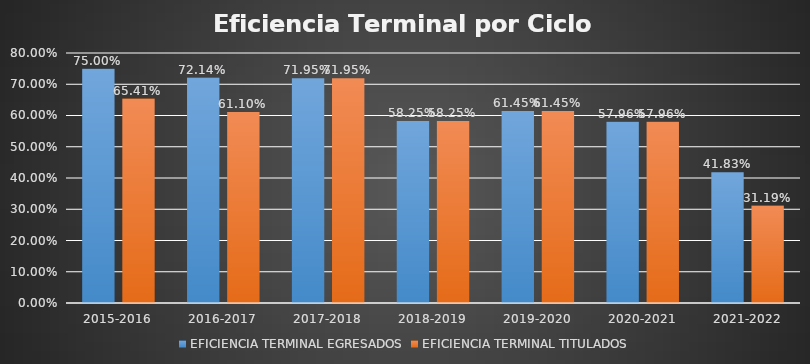
| Category | EFICIENCIA TERMINAL EGRESADOS | EFICIENCIA TERMINAL TITULADOS |
|---|---|---|
| 2015-2016 | 0.75 | 0.654 |
| 2016-2017 | 0.721 | 0.611 |
| 2017-2018 | 0.72 | 0.72 |
| 2018-2019 | 0.582 | 0.582 |
| 2019-2020 | 0.614 | 0.614 |
| 2020-2021 | 0.58 | 0.58 |
| 2021-2022 | 0.418 | 0.312 |